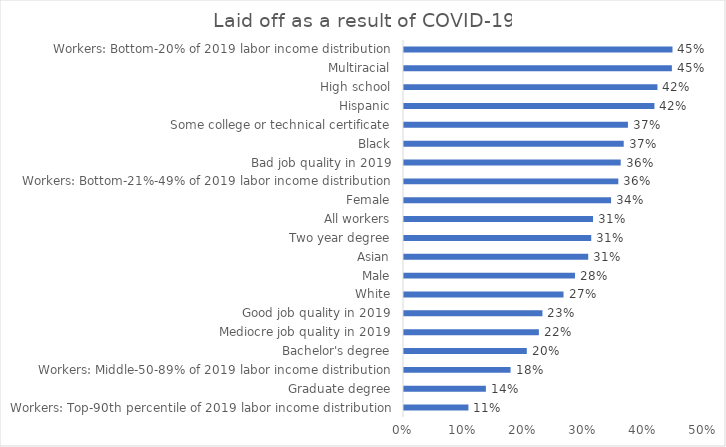
| Category | Laid off as a result of COVID-19 |
|---|---|
| Workers: Top-90th percentile of 2019 labor income distribution | 0.107 |
| Graduate degree | 0.136 |
| Workers: Middle-50-89% of 2019 labor income distribution | 0.177 |
| Bachelor's degree | 0.204 |
| Mediocre job quality in 2019 | 0.224 |
| Good job quality in 2019 | 0.23 |
| White | 0.265 |
| Male | 0.284 |
| Asian | 0.306 |
| Two year degree | 0.311 |
| All workers | 0.314 |
| Female | 0.344 |
| Workers: Bottom-21%-49% of 2019 labor income distribution | 0.356 |
| Bad job quality in 2019 | 0.36 |
| Black | 0.365 |
| Some college or technical certificate | 0.372 |
| Hispanic | 0.416 |
| High school | 0.421 |
| Multiracial | 0.445 |
| Workers: Bottom-20% of 2019 labor income distribution | 0.446 |